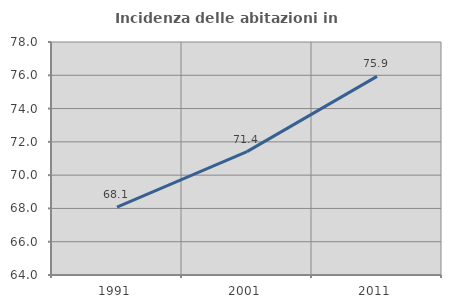
| Category | Incidenza delle abitazioni in proprietà  |
|---|---|
| 1991.0 | 68.076 |
| 2001.0 | 71.415 |
| 2011.0 | 75.935 |